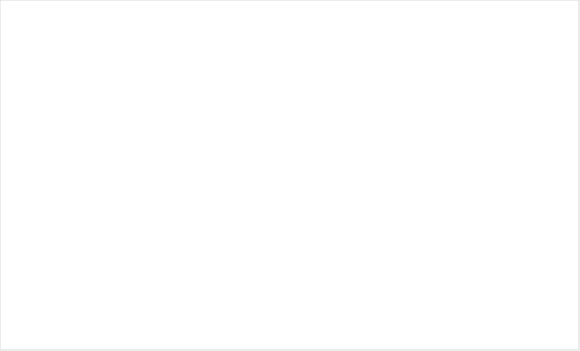
| Category | Итог |
|---|---|
| Ні | 1 |
| Так | 15 |